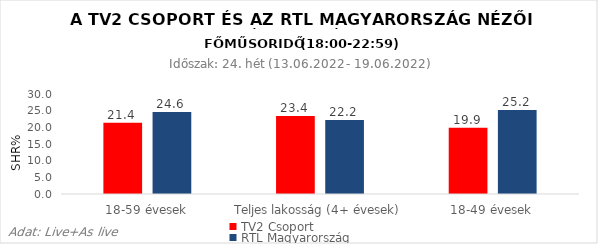
| Category | TV2 Csoport | RTL Magyarország |
|---|---|---|
| 18-59 évesek | 21.4 | 24.6 |
| Teljes lakosság (4+ évesek) | 23.4 | 22.2 |
| 18-49 évesek | 19.9 | 25.2 |